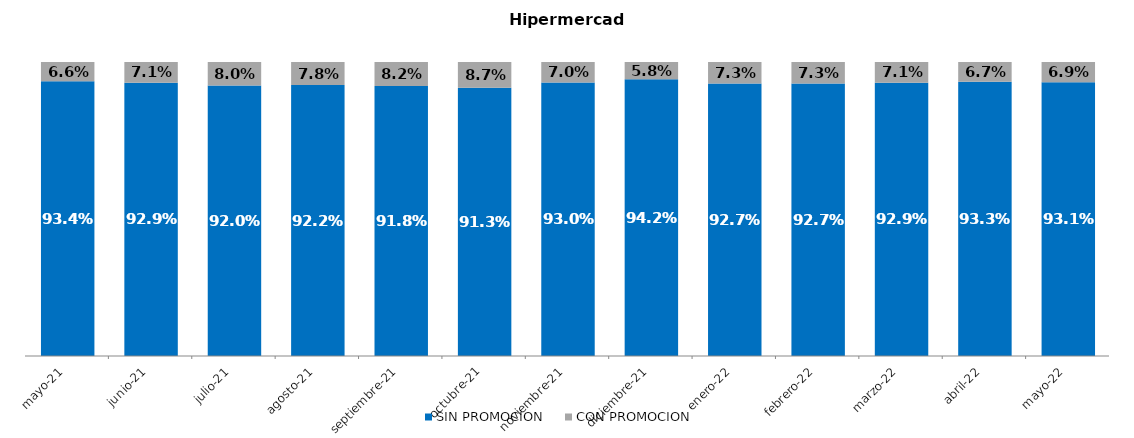
| Category | SIN PROMOCION   | CON PROMOCION   |
|---|---|---|
| 2021-05-01 | 0.934 | 0.066 |
| 2021-06-01 | 0.929 | 0.071 |
| 2021-07-01 | 0.92 | 0.08 |
| 2021-08-01 | 0.922 | 0.078 |
| 2021-09-01 | 0.918 | 0.082 |
| 2021-10-01 | 0.913 | 0.087 |
| 2021-11-01 | 0.93 | 0.07 |
| 2021-12-01 | 0.942 | 0.058 |
| 2022-01-01 | 0.927 | 0.073 |
| 2022-02-01 | 0.927 | 0.073 |
| 2022-03-01 | 0.929 | 0.071 |
| 2022-04-01 | 0.933 | 0.067 |
| 2022-05-01 | 0.931 | 0.069 |